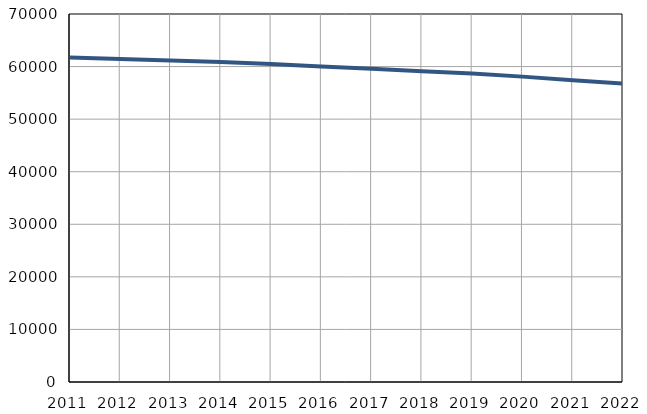
| Category | Број
становника |
|---|---|
| 2011.0 | 61740 |
| 2012.0 | 61454 |
| 2013.0 | 61147 |
| 2014.0 | 60850 |
| 2015.0 | 60482 |
| 2016.0 | 60035 |
| 2017.0 | 59563 |
| 2018.0 | 59131 |
| 2019.0 | 58689 |
| 2020.0 | 58087 |
| 2021.0 | 57396 |
| 2022.0 | 56754 |